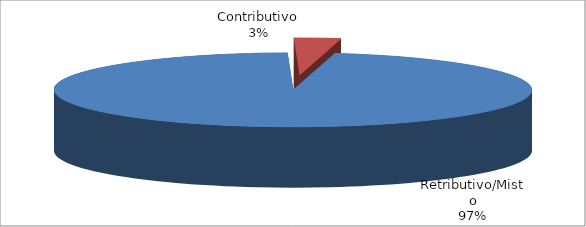
| Category | Series 1 |
|---|---|
| Retributivo/Misto | 34132 |
| Contributivo | 1112 |